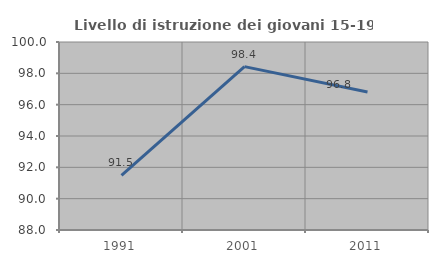
| Category | Livello di istruzione dei giovani 15-19 anni |
|---|---|
| 1991.0 | 91.48 |
| 2001.0 | 98.427 |
| 2011.0 | 96.812 |